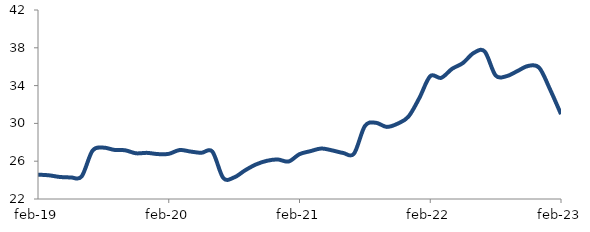
| Category | Series 0 |
|---|---|
| 2019-02-01 | 24.576 |
| 2019-03-01 | 24.507 |
| 2019-04-01 | 24.332 |
| 2019-05-01 | 24.288 |
| 2019-06-01 | 24.38 |
| 2019-07-01 | 27.111 |
| 2019-08-01 | 27.436 |
| 2019-09-01 | 27.198 |
| 2019-10-01 | 27.153 |
| 2019-11-01 | 26.835 |
| 2019-12-01 | 26.883 |
| 2020-01-01 | 26.753 |
| 2020-02-01 | 26.779 |
| 2020-03-01 | 27.182 |
| 2020-04-01 | 27.02 |
| 2020-05-01 | 26.889 |
| 2020-06-01 | 27.021 |
| 2020-07-01 | 24.232 |
| 2020-08-01 | 24.283 |
| 2020-09-01 | 25.03 |
| 2020-10-01 | 25.653 |
| 2020-11-01 | 26.039 |
| 2020-12-01 | 26.183 |
| 2021-01-01 | 25.97 |
| 2021-02-01 | 26.744 |
| 2021-03-01 | 27.062 |
| 2021-04-01 | 27.342 |
| 2021-05-01 | 27.143 |
| 2021-06-01 | 26.873 |
| 2021-07-01 | 26.797 |
| 2021-08-01 | 29.718 |
| 2021-09-01 | 30.068 |
| 2021-10-01 | 29.632 |
| 2021-11-01 | 29.968 |
| 2021-12-01 | 30.718 |
| 2022-01-01 | 32.688 |
| 2022-02-01 | 35.003 |
| 2022-03-01 | 34.822 |
| 2022-04-01 | 35.773 |
| 2022-05-01 | 36.392 |
| 2022-06-01 | 37.464 |
| 2022-07-01 | 37.604 |
| 2022-08-01 | 35.071 |
| 2022-09-01 | 34.995 |
| 2022-10-01 | 35.539 |
| 2022-11-01 | 36.084 |
| 2022-12-01 | 35.887 |
| 2023-01-01 | 33.585 |
| 2023-02-01 | 30.978 |